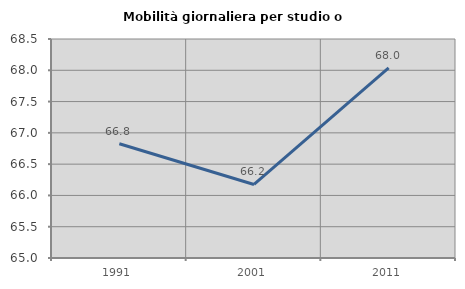
| Category | Mobilità giornaliera per studio o lavoro |
|---|---|
| 1991.0 | 66.825 |
| 2001.0 | 66.175 |
| 2011.0 | 68.037 |